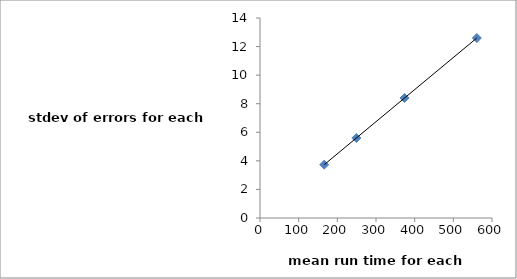
| Category | stdev(e) |
|---|---|
| 166.14285714285714 | 3.733 |
| 249.21428571428572 | 5.6 |
| 373.82142857142856 | 8.4 |
| 560.7321428571429 | 12.599 |